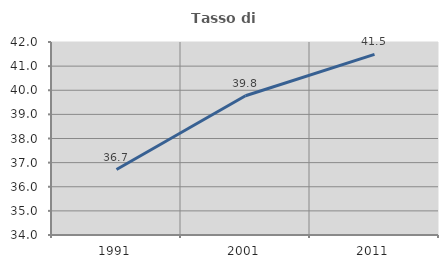
| Category | Tasso di occupazione   |
|---|---|
| 1991.0 | 36.713 |
| 2001.0 | 39.774 |
| 2011.0 | 41.485 |